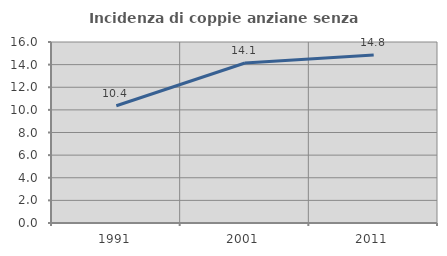
| Category | Incidenza di coppie anziane senza figli  |
|---|---|
| 1991.0 | 10.366 |
| 2001.0 | 14.143 |
| 2011.0 | 14.849 |